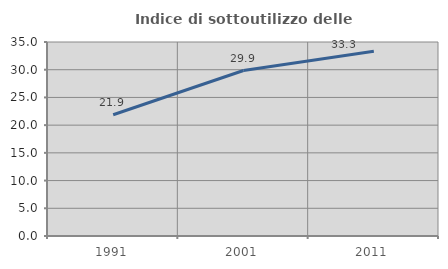
| Category | Indice di sottoutilizzo delle abitazioni  |
|---|---|
| 1991.0 | 21.881 |
| 2001.0 | 29.855 |
| 2011.0 | 33.316 |